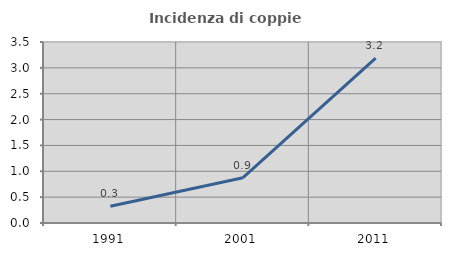
| Category | Incidenza di coppie miste |
|---|---|
| 1991.0 | 0.324 |
| 2001.0 | 0.876 |
| 2011.0 | 3.189 |